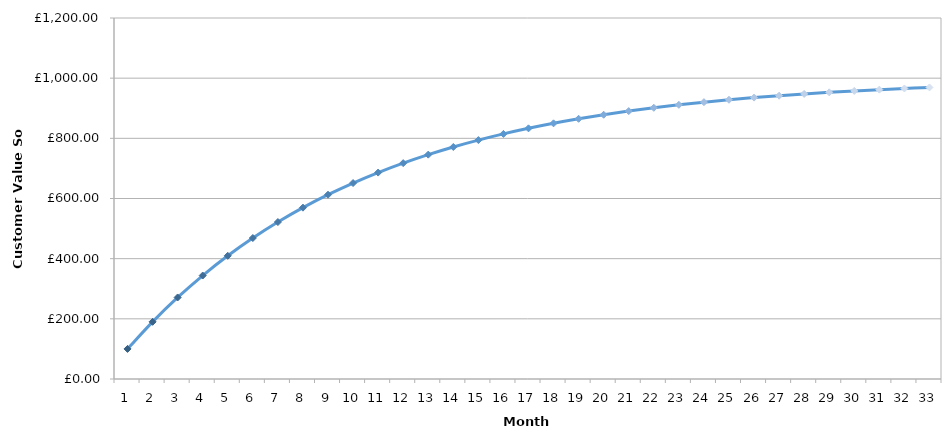
| Category | Customer Value So Far |
|---|---|
| 0 | 100 |
| 1 | 190 |
| 2 | 271 |
| 3 | 343.9 |
| 4 | 409.51 |
| 5 | 468.559 |
| 6 | 521.703 |
| 7 | 569.533 |
| 8 | 612.58 |
| 9 | 651.322 |
| 10 | 686.189 |
| 11 | 717.57 |
| 12 | 745.813 |
| 13 | 771.232 |
| 14 | 794.109 |
| 15 | 814.698 |
| 16 | 833.228 |
| 17 | 849.905 |
| 18 | 864.915 |
| 19 | 878.423 |
| 20 | 890.581 |
| 21 | 901.523 |
| 22 | 911.371 |
| 23 | 920.234 |
| 24 | 928.21 |
| 25 | 935.389 |
| 26 | 941.85 |
| 27 | 947.665 |
| 28 | 952.899 |
| 29 | 957.609 |
| 30 | 961.848 |
| 31 | 965.663 |
| 32 | 969.097 |